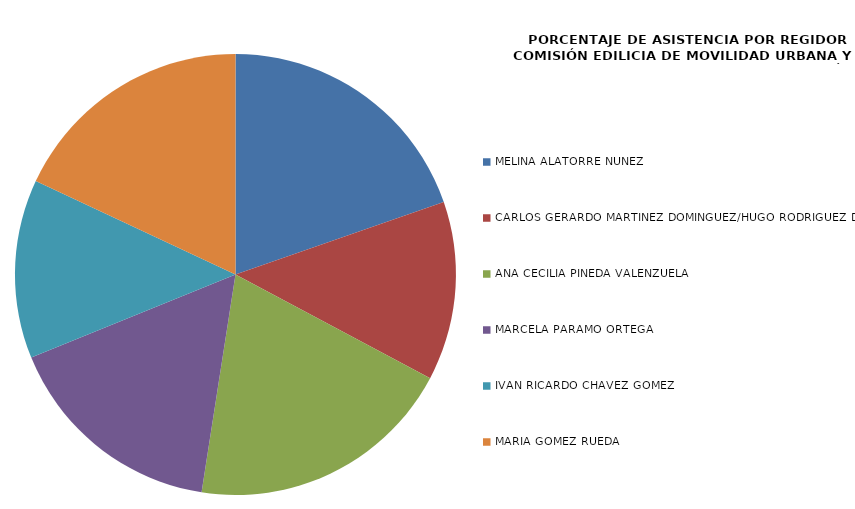
| Category | Series 0 |
|---|---|
| MELINA ALATORRE NÚÑEZ | 100 |
| CARLOS GERARDO MARTÍNEZ DOMÍNGUEZ/HUGO RODRÍGUEZ DÍAZ | 66.667 |
| ANA CECILIA PINEDA VALENZUELA | 100 |
| MARCELA PARÁMO ORTEGA | 83.333 |
| IVÁN RICARDO CHÁVEZ GÓMEZ | 66.667 |
| MARÍA GÓMEZ RUEDA | 91.667 |